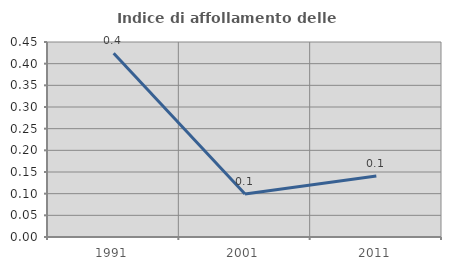
| Category | Indice di affollamento delle abitazioni  |
|---|---|
| 1991.0 | 0.424 |
| 2001.0 | 0.099 |
| 2011.0 | 0.141 |